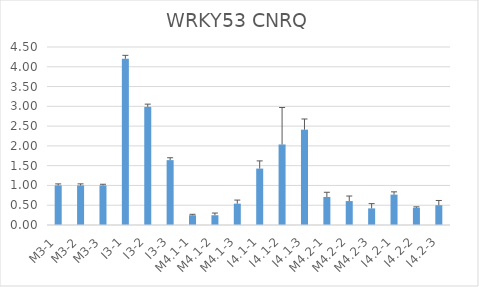
| Category | WRKY53 CNRQ |
|---|---|
| M3-1 | 1 |
| M3-2 | 1 |
| M3-3 | 1 |
| I3-1 | 4.203 |
| I3-2 | 2.986 |
| I3-3 | 1.64 |
| M4.1-1 | 0.247 |
| M4.1-2 | 0.247 |
| M4.1-3 | 0.54 |
| I4.1-1 | 1.426 |
| I4.1-2 | 2.036 |
| I4.1-3 | 2.41 |
| M4.2-1 | 0.709 |
| M4.2-2 | 0.605 |
| M4.2-3 | 0.42 |
| I4.2-1 | 0.768 |
| I4.2-2 | 0.435 |
| I4.2-3 | 0.5 |